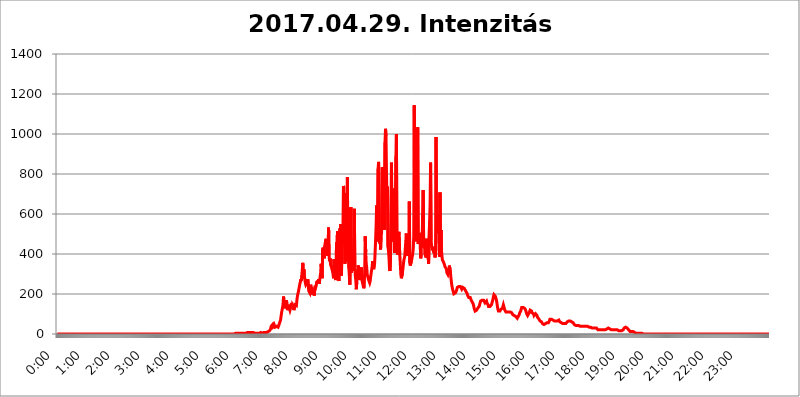
| Category | 2017.04.29. Intenzitás [W/m^2] |
|---|---|
| 0.0 | 0 |
| 0.0006944444444444445 | 0 |
| 0.001388888888888889 | 0 |
| 0.0020833333333333333 | 0 |
| 0.002777777777777778 | 0 |
| 0.003472222222222222 | 0 |
| 0.004166666666666667 | 0 |
| 0.004861111111111111 | 0 |
| 0.005555555555555556 | 0 |
| 0.0062499999999999995 | 0 |
| 0.006944444444444444 | 0 |
| 0.007638888888888889 | 0 |
| 0.008333333333333333 | 0 |
| 0.009027777777777779 | 0 |
| 0.009722222222222222 | 0 |
| 0.010416666666666666 | 0 |
| 0.011111111111111112 | 0 |
| 0.011805555555555555 | 0 |
| 0.012499999999999999 | 0 |
| 0.013194444444444444 | 0 |
| 0.013888888888888888 | 0 |
| 0.014583333333333332 | 0 |
| 0.015277777777777777 | 0 |
| 0.015972222222222224 | 0 |
| 0.016666666666666666 | 0 |
| 0.017361111111111112 | 0 |
| 0.018055555555555557 | 0 |
| 0.01875 | 0 |
| 0.019444444444444445 | 0 |
| 0.02013888888888889 | 0 |
| 0.020833333333333332 | 0 |
| 0.02152777777777778 | 0 |
| 0.022222222222222223 | 0 |
| 0.02291666666666667 | 0 |
| 0.02361111111111111 | 0 |
| 0.024305555555555556 | 0 |
| 0.024999999999999998 | 0 |
| 0.025694444444444447 | 0 |
| 0.02638888888888889 | 0 |
| 0.027083333333333334 | 0 |
| 0.027777777777777776 | 0 |
| 0.02847222222222222 | 0 |
| 0.029166666666666664 | 0 |
| 0.029861111111111113 | 0 |
| 0.030555555555555555 | 0 |
| 0.03125 | 0 |
| 0.03194444444444445 | 0 |
| 0.03263888888888889 | 0 |
| 0.03333333333333333 | 0 |
| 0.034027777777777775 | 0 |
| 0.034722222222222224 | 0 |
| 0.035416666666666666 | 0 |
| 0.036111111111111115 | 0 |
| 0.03680555555555556 | 0 |
| 0.0375 | 0 |
| 0.03819444444444444 | 0 |
| 0.03888888888888889 | 0 |
| 0.03958333333333333 | 0 |
| 0.04027777777777778 | 0 |
| 0.04097222222222222 | 0 |
| 0.041666666666666664 | 0 |
| 0.042361111111111106 | 0 |
| 0.04305555555555556 | 0 |
| 0.043750000000000004 | 0 |
| 0.044444444444444446 | 0 |
| 0.04513888888888889 | 0 |
| 0.04583333333333334 | 0 |
| 0.04652777777777778 | 0 |
| 0.04722222222222222 | 0 |
| 0.04791666666666666 | 0 |
| 0.04861111111111111 | 0 |
| 0.049305555555555554 | 0 |
| 0.049999999999999996 | 0 |
| 0.05069444444444445 | 0 |
| 0.051388888888888894 | 0 |
| 0.052083333333333336 | 0 |
| 0.05277777777777778 | 0 |
| 0.05347222222222222 | 0 |
| 0.05416666666666667 | 0 |
| 0.05486111111111111 | 0 |
| 0.05555555555555555 | 0 |
| 0.05625 | 0 |
| 0.05694444444444444 | 0 |
| 0.057638888888888885 | 0 |
| 0.05833333333333333 | 0 |
| 0.05902777777777778 | 0 |
| 0.059722222222222225 | 0 |
| 0.06041666666666667 | 0 |
| 0.061111111111111116 | 0 |
| 0.06180555555555556 | 0 |
| 0.0625 | 0 |
| 0.06319444444444444 | 0 |
| 0.06388888888888888 | 0 |
| 0.06458333333333334 | 0 |
| 0.06527777777777778 | 0 |
| 0.06597222222222222 | 0 |
| 0.06666666666666667 | 0 |
| 0.06736111111111111 | 0 |
| 0.06805555555555555 | 0 |
| 0.06874999999999999 | 0 |
| 0.06944444444444443 | 0 |
| 0.07013888888888889 | 0 |
| 0.07083333333333333 | 0 |
| 0.07152777777777779 | 0 |
| 0.07222222222222223 | 0 |
| 0.07291666666666667 | 0 |
| 0.07361111111111111 | 0 |
| 0.07430555555555556 | 0 |
| 0.075 | 0 |
| 0.07569444444444444 | 0 |
| 0.0763888888888889 | 0 |
| 0.07708333333333334 | 0 |
| 0.07777777777777778 | 0 |
| 0.07847222222222222 | 0 |
| 0.07916666666666666 | 0 |
| 0.0798611111111111 | 0 |
| 0.08055555555555556 | 0 |
| 0.08125 | 0 |
| 0.08194444444444444 | 0 |
| 0.08263888888888889 | 0 |
| 0.08333333333333333 | 0 |
| 0.08402777777777777 | 0 |
| 0.08472222222222221 | 0 |
| 0.08541666666666665 | 0 |
| 0.08611111111111112 | 0 |
| 0.08680555555555557 | 0 |
| 0.08750000000000001 | 0 |
| 0.08819444444444445 | 0 |
| 0.08888888888888889 | 0 |
| 0.08958333333333333 | 0 |
| 0.09027777777777778 | 0 |
| 0.09097222222222222 | 0 |
| 0.09166666666666667 | 0 |
| 0.09236111111111112 | 0 |
| 0.09305555555555556 | 0 |
| 0.09375 | 0 |
| 0.09444444444444444 | 0 |
| 0.09513888888888888 | 0 |
| 0.09583333333333333 | 0 |
| 0.09652777777777777 | 0 |
| 0.09722222222222222 | 0 |
| 0.09791666666666667 | 0 |
| 0.09861111111111111 | 0 |
| 0.09930555555555555 | 0 |
| 0.09999999999999999 | 0 |
| 0.10069444444444443 | 0 |
| 0.1013888888888889 | 0 |
| 0.10208333333333335 | 0 |
| 0.10277777777777779 | 0 |
| 0.10347222222222223 | 0 |
| 0.10416666666666667 | 0 |
| 0.10486111111111111 | 0 |
| 0.10555555555555556 | 0 |
| 0.10625 | 0 |
| 0.10694444444444444 | 0 |
| 0.1076388888888889 | 0 |
| 0.10833333333333334 | 0 |
| 0.10902777777777778 | 0 |
| 0.10972222222222222 | 0 |
| 0.1111111111111111 | 0 |
| 0.11180555555555556 | 0 |
| 0.11180555555555556 | 0 |
| 0.1125 | 0 |
| 0.11319444444444444 | 0 |
| 0.11388888888888889 | 0 |
| 0.11458333333333333 | 0 |
| 0.11527777777777777 | 0 |
| 0.11597222222222221 | 0 |
| 0.11666666666666665 | 0 |
| 0.1173611111111111 | 0 |
| 0.11805555555555557 | 0 |
| 0.11944444444444445 | 0 |
| 0.12013888888888889 | 0 |
| 0.12083333333333333 | 0 |
| 0.12152777777777778 | 0 |
| 0.12222222222222223 | 0 |
| 0.12291666666666667 | 0 |
| 0.12291666666666667 | 0 |
| 0.12361111111111112 | 0 |
| 0.12430555555555556 | 0 |
| 0.125 | 0 |
| 0.12569444444444444 | 0 |
| 0.12638888888888888 | 0 |
| 0.12708333333333333 | 0 |
| 0.16875 | 0 |
| 0.12847222222222224 | 0 |
| 0.12916666666666668 | 0 |
| 0.12986111111111112 | 0 |
| 0.13055555555555556 | 0 |
| 0.13125 | 0 |
| 0.13194444444444445 | 0 |
| 0.1326388888888889 | 0 |
| 0.13333333333333333 | 0 |
| 0.13402777777777777 | 0 |
| 0.13402777777777777 | 0 |
| 0.13472222222222222 | 0 |
| 0.13541666666666666 | 0 |
| 0.1361111111111111 | 0 |
| 0.13749999999999998 | 0 |
| 0.13819444444444443 | 0 |
| 0.1388888888888889 | 0 |
| 0.13958333333333334 | 0 |
| 0.14027777777777778 | 0 |
| 0.14097222222222222 | 0 |
| 0.14166666666666666 | 0 |
| 0.1423611111111111 | 0 |
| 0.14305555555555557 | 0 |
| 0.14375000000000002 | 0 |
| 0.14444444444444446 | 0 |
| 0.1451388888888889 | 0 |
| 0.1451388888888889 | 0 |
| 0.14652777777777778 | 0 |
| 0.14722222222222223 | 0 |
| 0.14791666666666667 | 0 |
| 0.1486111111111111 | 0 |
| 0.14930555555555555 | 0 |
| 0.15 | 0 |
| 0.15069444444444444 | 0 |
| 0.15138888888888888 | 0 |
| 0.15208333333333332 | 0 |
| 0.15277777777777776 | 0 |
| 0.15347222222222223 | 0 |
| 0.15416666666666667 | 0 |
| 0.15486111111111112 | 0 |
| 0.15555555555555556 | 0 |
| 0.15625 | 0 |
| 0.15694444444444444 | 0 |
| 0.15763888888888888 | 0 |
| 0.15833333333333333 | 0 |
| 0.15902777777777777 | 0 |
| 0.15972222222222224 | 0 |
| 0.16041666666666668 | 0 |
| 0.16111111111111112 | 0 |
| 0.16180555555555556 | 0 |
| 0.1625 | 0 |
| 0.16319444444444445 | 0 |
| 0.1638888888888889 | 0 |
| 0.16458333333333333 | 0 |
| 0.16527777777777777 | 0 |
| 0.16597222222222222 | 0 |
| 0.16666666666666666 | 0 |
| 0.1673611111111111 | 0 |
| 0.16805555555555554 | 0 |
| 0.16874999999999998 | 0 |
| 0.16944444444444443 | 0 |
| 0.17013888888888887 | 0 |
| 0.1708333333333333 | 0 |
| 0.17152777777777775 | 0 |
| 0.17222222222222225 | 0 |
| 0.1729166666666667 | 0 |
| 0.17361111111111113 | 0 |
| 0.17430555555555557 | 0 |
| 0.17500000000000002 | 0 |
| 0.17569444444444446 | 0 |
| 0.1763888888888889 | 0 |
| 0.17708333333333334 | 0 |
| 0.17777777777777778 | 0 |
| 0.17847222222222223 | 0 |
| 0.17916666666666667 | 0 |
| 0.1798611111111111 | 0 |
| 0.18055555555555555 | 0 |
| 0.18125 | 0 |
| 0.18194444444444444 | 0 |
| 0.1826388888888889 | 0 |
| 0.18333333333333335 | 0 |
| 0.1840277777777778 | 0 |
| 0.18472222222222223 | 0 |
| 0.18541666666666667 | 0 |
| 0.18611111111111112 | 0 |
| 0.18680555555555556 | 0 |
| 0.1875 | 0 |
| 0.18819444444444444 | 0 |
| 0.18888888888888888 | 0 |
| 0.18958333333333333 | 0 |
| 0.19027777777777777 | 0 |
| 0.1909722222222222 | 0 |
| 0.19166666666666665 | 0 |
| 0.19236111111111112 | 0 |
| 0.19305555555555554 | 0 |
| 0.19375 | 0 |
| 0.19444444444444445 | 0 |
| 0.1951388888888889 | 0 |
| 0.19583333333333333 | 0 |
| 0.19652777777777777 | 0 |
| 0.19722222222222222 | 0 |
| 0.19791666666666666 | 0 |
| 0.1986111111111111 | 0 |
| 0.19930555555555554 | 0 |
| 0.19999999999999998 | 0 |
| 0.20069444444444443 | 0 |
| 0.20138888888888887 | 0 |
| 0.2020833333333333 | 0 |
| 0.2027777777777778 | 0 |
| 0.2034722222222222 | 0 |
| 0.2041666666666667 | 0 |
| 0.20486111111111113 | 0 |
| 0.20555555555555557 | 0 |
| 0.20625000000000002 | 0 |
| 0.20694444444444446 | 0 |
| 0.2076388888888889 | 0 |
| 0.20833333333333334 | 0 |
| 0.20902777777777778 | 0 |
| 0.20972222222222223 | 0 |
| 0.21041666666666667 | 0 |
| 0.2111111111111111 | 0 |
| 0.21180555555555555 | 0 |
| 0.2125 | 0 |
| 0.21319444444444444 | 0 |
| 0.2138888888888889 | 0 |
| 0.21458333333333335 | 0 |
| 0.2152777777777778 | 0 |
| 0.21597222222222223 | 0 |
| 0.21666666666666667 | 0 |
| 0.21736111111111112 | 0 |
| 0.21805555555555556 | 0 |
| 0.21875 | 0 |
| 0.21944444444444444 | 0 |
| 0.22013888888888888 | 0 |
| 0.22083333333333333 | 0 |
| 0.22152777777777777 | 0 |
| 0.2222222222222222 | 0 |
| 0.22291666666666665 | 0 |
| 0.2236111111111111 | 0 |
| 0.22430555555555556 | 0 |
| 0.225 | 0 |
| 0.22569444444444445 | 0 |
| 0.2263888888888889 | 0 |
| 0.22708333333333333 | 0 |
| 0.22777777777777777 | 0 |
| 0.22847222222222222 | 0 |
| 0.22916666666666666 | 0 |
| 0.2298611111111111 | 0 |
| 0.23055555555555554 | 0 |
| 0.23124999999999998 | 0 |
| 0.23194444444444443 | 0 |
| 0.23263888888888887 | 0 |
| 0.2333333333333333 | 0 |
| 0.2340277777777778 | 0 |
| 0.2347222222222222 | 0 |
| 0.2354166666666667 | 0 |
| 0.23611111111111113 | 0 |
| 0.23680555555555557 | 0 |
| 0.23750000000000002 | 0 |
| 0.23819444444444446 | 0 |
| 0.2388888888888889 | 0 |
| 0.23958333333333334 | 0 |
| 0.24027777777777778 | 0 |
| 0.24097222222222223 | 0 |
| 0.24166666666666667 | 0 |
| 0.2423611111111111 | 0 |
| 0.24305555555555555 | 0 |
| 0.24375 | 0 |
| 0.24444444444444446 | 0 |
| 0.24513888888888888 | 0 |
| 0.24583333333333335 | 0 |
| 0.2465277777777778 | 0 |
| 0.24722222222222223 | 0 |
| 0.24791666666666667 | 0 |
| 0.24861111111111112 | 0 |
| 0.24930555555555556 | 0 |
| 0.25 | 3.525 |
| 0.25069444444444444 | 3.525 |
| 0.2513888888888889 | 3.525 |
| 0.2520833333333333 | 3.525 |
| 0.25277777777777777 | 3.525 |
| 0.2534722222222222 | 3.525 |
| 0.25416666666666665 | 3.525 |
| 0.2548611111111111 | 3.525 |
| 0.2555555555555556 | 3.525 |
| 0.25625000000000003 | 3.525 |
| 0.2569444444444445 | 3.525 |
| 0.2576388888888889 | 3.525 |
| 0.25833333333333336 | 3.525 |
| 0.2590277777777778 | 3.525 |
| 0.25972222222222224 | 3.525 |
| 0.2604166666666667 | 3.525 |
| 0.2611111111111111 | 3.525 |
| 0.26180555555555557 | 3.525 |
| 0.2625 | 3.525 |
| 0.26319444444444445 | 3.525 |
| 0.2638888888888889 | 3.525 |
| 0.26458333333333334 | 3.525 |
| 0.2652777777777778 | 7.887 |
| 0.2659722222222222 | 7.887 |
| 0.26666666666666666 | 7.887 |
| 0.2673611111111111 | 7.887 |
| 0.26805555555555555 | 7.887 |
| 0.26875 | 7.887 |
| 0.26944444444444443 | 7.887 |
| 0.2701388888888889 | 7.887 |
| 0.2708333333333333 | 7.887 |
| 0.27152777777777776 | 7.887 |
| 0.2722222222222222 | 12.257 |
| 0.27291666666666664 | 7.887 |
| 0.2736111111111111 | 7.887 |
| 0.2743055555555555 | 12.257 |
| 0.27499999999999997 | 7.887 |
| 0.27569444444444446 | 7.887 |
| 0.27638888888888885 | 7.887 |
| 0.27708333333333335 | 3.525 |
| 0.2777777777777778 | 3.525 |
| 0.27847222222222223 | 3.525 |
| 0.2791666666666667 | 3.525 |
| 0.2798611111111111 | 3.525 |
| 0.28055555555555556 | 3.525 |
| 0.28125 | 3.525 |
| 0.28194444444444444 | 3.525 |
| 0.2826388888888889 | 3.525 |
| 0.2833333333333333 | 3.525 |
| 0.28402777777777777 | 3.525 |
| 0.2847222222222222 | 7.887 |
| 0.28541666666666665 | 7.887 |
| 0.28611111111111115 | 3.525 |
| 0.28680555555555554 | 3.525 |
| 0.28750000000000003 | 3.525 |
| 0.2881944444444445 | 7.887 |
| 0.2888888888888889 | 7.887 |
| 0.28958333333333336 | 7.887 |
| 0.2902777777777778 | 7.887 |
| 0.29097222222222224 | 7.887 |
| 0.2916666666666667 | 7.887 |
| 0.2923611111111111 | 7.887 |
| 0.29305555555555557 | 7.887 |
| 0.29375 | 7.887 |
| 0.29444444444444445 | 7.887 |
| 0.2951388888888889 | 12.257 |
| 0.29583333333333334 | 12.257 |
| 0.2965277777777778 | 12.257 |
| 0.2972222222222222 | 12.257 |
| 0.29791666666666666 | 16.636 |
| 0.2986111111111111 | 21.024 |
| 0.29930555555555555 | 25.419 |
| 0.3 | 38.653 |
| 0.30069444444444443 | 43.079 |
| 0.3013888888888889 | 43.079 |
| 0.3020833333333333 | 47.511 |
| 0.30277777777777776 | 38.653 |
| 0.3034722222222222 | 38.653 |
| 0.30416666666666664 | 47.511 |
| 0.3048611111111111 | 47.511 |
| 0.3055555555555555 | 34.234 |
| 0.30624999999999997 | 29.823 |
| 0.3069444444444444 | 29.823 |
| 0.3076388888888889 | 38.653 |
| 0.30833333333333335 | 38.653 |
| 0.3090277777777778 | 34.234 |
| 0.30972222222222223 | 34.234 |
| 0.3104166666666667 | 38.653 |
| 0.3111111111111111 | 47.511 |
| 0.31180555555555556 | 51.951 |
| 0.3125 | 51.951 |
| 0.31319444444444444 | 69.775 |
| 0.3138888888888889 | 87.692 |
| 0.3145833333333333 | 105.69 |
| 0.31527777777777777 | 119.235 |
| 0.3159722222222222 | 119.235 |
| 0.31666666666666665 | 146.423 |
| 0.31736111111111115 | 187.378 |
| 0.31805555555555554 | 160.056 |
| 0.31875000000000003 | 137.347 |
| 0.3194444444444445 | 128.284 |
| 0.3201388888888889 | 128.284 |
| 0.32083333333333336 | 132.814 |
| 0.3215277777777778 | 169.156 |
| 0.32222222222222224 | 137.347 |
| 0.3229166666666667 | 119.235 |
| 0.3236111111111111 | 123.758 |
| 0.32430555555555557 | 146.423 |
| 0.325 | 150.964 |
| 0.32569444444444445 | 128.284 |
| 0.3263888888888889 | 119.235 |
| 0.32708333333333334 | 119.235 |
| 0.3277777777777778 | 137.347 |
| 0.3284722222222222 | 155.509 |
| 0.32916666666666666 | 128.284 |
| 0.3298611111111111 | 146.423 |
| 0.33055555555555555 | 141.884 |
| 0.33125 | 137.347 |
| 0.33194444444444443 | 119.235 |
| 0.3326388888888889 | 123.758 |
| 0.3333333333333333 | 146.423 |
| 0.3340277777777778 | 146.423 |
| 0.3347222222222222 | 146.423 |
| 0.3354166666666667 | 141.884 |
| 0.3361111111111111 | 169.156 |
| 0.3368055555555556 | 187.378 |
| 0.33749999999999997 | 201.058 |
| 0.33819444444444446 | 210.182 |
| 0.33888888888888885 | 210.182 |
| 0.33958333333333335 | 205.62 |
| 0.34027777777777773 | 251.251 |
| 0.34097222222222223 | 260.373 |
| 0.3416666666666666 | 274.047 |
| 0.3423611111111111 | 264.932 |
| 0.3430555555555555 | 292.259 |
| 0.34375 | 296.808 |
| 0.3444444444444445 | 355.712 |
| 0.3451388888888889 | 278.603 |
| 0.3458333333333334 | 324.052 |
| 0.34652777777777777 | 292.259 |
| 0.34722222222222227 | 287.709 |
| 0.34791666666666665 | 255.813 |
| 0.34861111111111115 | 246.689 |
| 0.34930555555555554 | 242.127 |
| 0.35000000000000003 | 255.813 |
| 0.3506944444444444 | 260.373 |
| 0.3513888888888889 | 274.047 |
| 0.3520833333333333 | 242.127 |
| 0.3527777777777778 | 214.746 |
| 0.3534722222222222 | 214.746 |
| 0.3541666666666667 | 205.62 |
| 0.3548611111111111 | 228.436 |
| 0.35555555555555557 | 246.689 |
| 0.35625 | 219.309 |
| 0.35694444444444445 | 233 |
| 0.3576388888888889 | 205.62 |
| 0.35833333333333334 | 210.182 |
| 0.3590277777777778 | 201.058 |
| 0.3597222222222222 | 210.182 |
| 0.36041666666666666 | 191.937 |
| 0.3611111111111111 | 228.436 |
| 0.36180555555555555 | 242.127 |
| 0.3625 | 233 |
| 0.36319444444444443 | 242.127 |
| 0.3638888888888889 | 260.373 |
| 0.3645833333333333 | 255.813 |
| 0.3652777777777778 | 255.813 |
| 0.3659722222222222 | 264.932 |
| 0.3666666666666667 | 274.047 |
| 0.3673611111111111 | 251.251 |
| 0.3680555555555556 | 269.49 |
| 0.36874999999999997 | 274.047 |
| 0.36944444444444446 | 305.898 |
| 0.37013888888888885 | 351.198 |
| 0.37083333333333335 | 314.98 |
| 0.37152777777777773 | 278.603 |
| 0.37222222222222223 | 422.943 |
| 0.3729166666666666 | 431.833 |
| 0.3736111111111111 | 396.164 |
| 0.3743055555555555 | 378.224 |
| 0.375 | 436.27 |
| 0.3756944444444445 | 431.833 |
| 0.3763888888888889 | 467.187 |
| 0.3770833333333334 | 475.972 |
| 0.37777777777777777 | 436.27 |
| 0.37847222222222227 | 400.638 |
| 0.37916666666666665 | 391.685 |
| 0.37986111111111115 | 445.129 |
| 0.38055555555555554 | 532.513 |
| 0.38125000000000003 | 391.685 |
| 0.3819444444444444 | 364.728 |
| 0.3826388888888889 | 378.224 |
| 0.3833333333333333 | 346.682 |
| 0.3840277777777778 | 351.198 |
| 0.3847222222222222 | 333.113 |
| 0.3854166666666667 | 337.639 |
| 0.3861111111111111 | 328.584 |
| 0.38680555555555557 | 301.354 |
| 0.3875 | 278.603 |
| 0.38819444444444445 | 373.729 |
| 0.3888888888888889 | 337.639 |
| 0.38958333333333334 | 355.712 |
| 0.3902777777777778 | 269.49 |
| 0.3909722222222222 | 305.898 |
| 0.39166666666666666 | 458.38 |
| 0.3923611111111111 | 431.833 |
| 0.39305555555555555 | 515.223 |
| 0.39375 | 364.728 |
| 0.39444444444444443 | 278.603 |
| 0.3951388888888889 | 264.932 |
| 0.3958333333333333 | 471.582 |
| 0.3965277777777778 | 528.2 |
| 0.3972222222222222 | 324.052 |
| 0.3979166666666667 | 549.704 |
| 0.3986111111111111 | 292.259 |
| 0.3993055555555556 | 449.551 |
| 0.39999999999999997 | 484.735 |
| 0.40069444444444446 | 515.223 |
| 0.40138888888888885 | 739.877 |
| 0.40208333333333335 | 731.896 |
| 0.40277777777777773 | 480.356 |
| 0.40347222222222223 | 351.198 |
| 0.4041666666666666 | 436.27 |
| 0.4048611111111111 | 703.762 |
| 0.4055555555555555 | 360.221 |
| 0.40625 | 418.492 |
| 0.4069444444444445 | 783.342 |
| 0.4076388888888889 | 360.221 |
| 0.4083333333333334 | 558.261 |
| 0.40902777777777777 | 328.584 |
| 0.40972222222222227 | 287.709 |
| 0.41041666666666665 | 246.689 |
| 0.41111111111111115 | 251.251 |
| 0.41180555555555554 | 634.105 |
| 0.41250000000000003 | 305.898 |
| 0.4131944444444444 | 355.712 |
| 0.4138888888888889 | 364.728 |
| 0.4145833333333333 | 314.98 |
| 0.4152777777777778 | 337.639 |
| 0.4159722222222222 | 467.187 |
| 0.4166666666666667 | 625.784 |
| 0.4173611111111111 | 333.113 |
| 0.41805555555555557 | 287.709 |
| 0.41875 | 269.49 |
| 0.41944444444444445 | 223.873 |
| 0.4201388888888889 | 260.373 |
| 0.42083333333333334 | 319.517 |
| 0.4215277777777778 | 296.808 |
| 0.4222222222222222 | 342.162 |
| 0.42291666666666666 | 292.259 |
| 0.4236111111111111 | 269.49 |
| 0.42430555555555555 | 292.259 |
| 0.425 | 301.354 |
| 0.42569444444444443 | 310.44 |
| 0.4263888888888889 | 333.113 |
| 0.4270833333333333 | 283.156 |
| 0.4277777777777778 | 260.373 |
| 0.4284722222222222 | 251.251 |
| 0.4291666666666667 | 251.251 |
| 0.4298611111111111 | 228.436 |
| 0.4305555555555556 | 242.127 |
| 0.43124999999999997 | 324.052 |
| 0.43194444444444446 | 489.108 |
| 0.43263888888888885 | 409.574 |
| 0.43333333333333335 | 351.198 |
| 0.43402777777777773 | 333.113 |
| 0.43472222222222223 | 296.808 |
| 0.4354166666666666 | 292.259 |
| 0.4361111111111111 | 278.603 |
| 0.4368055555555555 | 269.49 |
| 0.4375 | 264.932 |
| 0.4381944444444445 | 255.813 |
| 0.4388888888888889 | 264.932 |
| 0.4395833333333334 | 287.709 |
| 0.44027777777777777 | 287.709 |
| 0.44097222222222227 | 287.709 |
| 0.44166666666666665 | 337.639 |
| 0.44236111111111115 | 364.728 |
| 0.44305555555555554 | 333.113 |
| 0.44375000000000003 | 324.052 |
| 0.4444444444444444 | 319.517 |
| 0.4451388888888889 | 355.712 |
| 0.4458333333333333 | 409.574 |
| 0.4465277777777778 | 471.582 |
| 0.4472222222222222 | 541.121 |
| 0.4479166666666667 | 642.4 |
| 0.4486111111111111 | 519.555 |
| 0.44930555555555557 | 462.786 |
| 0.45 | 826.123 |
| 0.45069444444444445 | 860.676 |
| 0.4513888888888889 | 549.704 |
| 0.45208333333333334 | 453.968 |
| 0.4527777777777778 | 489.108 |
| 0.4534722222222222 | 422.943 |
| 0.45416666666666666 | 484.735 |
| 0.4548611111111111 | 506.542 |
| 0.45555555555555555 | 833.834 |
| 0.45625 | 826.123 |
| 0.45694444444444443 | 523.88 |
| 0.4576388888888889 | 536.82 |
| 0.4583333333333333 | 822.26 |
| 0.4590277777777778 | 519.555 |
| 0.4597222222222222 | 958.814 |
| 0.4604166666666667 | 1026.06 |
| 0.4611111111111111 | 988.714 |
| 0.4618055555555556 | 798.974 |
| 0.46249999999999997 | 658.909 |
| 0.46319444444444446 | 735.89 |
| 0.46388888888888885 | 436.27 |
| 0.46458333333333335 | 414.035 |
| 0.46527777777777773 | 382.715 |
| 0.46597222222222223 | 328.584 |
| 0.4666666666666666 | 314.98 |
| 0.4673611111111111 | 373.729 |
| 0.4680555555555555 | 378.224 |
| 0.46875 | 856.855 |
| 0.4694444444444445 | 480.356 |
| 0.4701388888888889 | 558.261 |
| 0.4708333333333334 | 727.896 |
| 0.47152777777777777 | 462.786 |
| 0.47222222222222227 | 715.858 |
| 0.47291666666666665 | 405.108 |
| 0.47361111111111115 | 519.555 |
| 0.47430555555555554 | 489.108 |
| 0.47500000000000003 | 887.309 |
| 0.4756944444444444 | 999.916 |
| 0.4763888888888889 | 431.833 |
| 0.4770833333333333 | 396.164 |
| 0.4777777777777778 | 458.38 |
| 0.4784722222222222 | 458.38 |
| 0.4791666666666667 | 510.885 |
| 0.4798611111111111 | 449.551 |
| 0.48055555555555557 | 387.202 |
| 0.48125 | 342.162 |
| 0.48194444444444445 | 296.808 |
| 0.4826388888888889 | 278.603 |
| 0.48333333333333334 | 283.156 |
| 0.4840277777777778 | 301.354 |
| 0.4847222222222222 | 324.052 |
| 0.48541666666666666 | 346.682 |
| 0.4861111111111111 | 369.23 |
| 0.48680555555555555 | 378.224 |
| 0.4875 | 391.685 |
| 0.48819444444444443 | 387.202 |
| 0.4888888888888889 | 396.164 |
| 0.4895833333333333 | 502.192 |
| 0.4902777777777778 | 431.833 |
| 0.4909722222222222 | 391.685 |
| 0.4916666666666667 | 400.638 |
| 0.4923611111111111 | 414.035 |
| 0.4930555555555556 | 431.833 |
| 0.49374999999999997 | 663.019 |
| 0.49444444444444446 | 355.712 |
| 0.49513888888888885 | 342.162 |
| 0.49583333333333335 | 346.682 |
| 0.49652777777777773 | 346.682 |
| 0.49722222222222223 | 373.729 |
| 0.4979166666666666 | 387.202 |
| 0.4986111111111111 | 400.638 |
| 0.4993055555555555 | 427.39 |
| 0.5 | 489.108 |
| 0.5006944444444444 | 1143.232 |
| 0.5013888888888889 | 484.735 |
| 0.5020833333333333 | 617.436 |
| 0.5027777777777778 | 475.972 |
| 0.5034722222222222 | 462.786 |
| 0.5041666666666667 | 489.108 |
| 0.5048611111111111 | 675.311 |
| 0.5055555555555555 | 1033.537 |
| 0.50625 | 449.551 |
| 0.5069444444444444 | 462.786 |
| 0.5076388888888889 | 462.786 |
| 0.5083333333333333 | 502.192 |
| 0.5090277777777777 | 449.551 |
| 0.5097222222222222 | 378.224 |
| 0.5104166666666666 | 396.164 |
| 0.5111111111111112 | 506.542 |
| 0.5118055555555555 | 431.833 |
| 0.5125000000000001 | 600.661 |
| 0.5131944444444444 | 719.877 |
| 0.513888888888889 | 458.38 |
| 0.5145833333333333 | 440.702 |
| 0.5152777777777778 | 453.968 |
| 0.5159722222222222 | 396.164 |
| 0.5166666666666667 | 391.685 |
| 0.517361111111111 | 382.715 |
| 0.5180555555555556 | 475.972 |
| 0.5187499999999999 | 409.574 |
| 0.5194444444444445 | 382.715 |
| 0.5201388888888888 | 396.164 |
| 0.5208333333333334 | 351.198 |
| 0.5215277777777778 | 351.198 |
| 0.5222222222222223 | 562.53 |
| 0.5229166666666667 | 646.537 |
| 0.5236111111111111 | 856.855 |
| 0.5243055555555556 | 471.582 |
| 0.525 | 440.702 |
| 0.5256944444444445 | 431.833 |
| 0.5263888888888889 | 418.492 |
| 0.5270833333333333 | 436.27 |
| 0.5277777777777778 | 409.574 |
| 0.5284722222222222 | 414.035 |
| 0.5291666666666667 | 400.638 |
| 0.5298611111111111 | 382.715 |
| 0.5305555555555556 | 400.638 |
| 0.53125 | 984.98 |
| 0.5319444444444444 | 532.513 |
| 0.5326388888888889 | 562.53 |
| 0.5333333333333333 | 545.416 |
| 0.5340277777777778 | 596.45 |
| 0.5347222222222222 | 528.2 |
| 0.5354166666666667 | 427.39 |
| 0.5361111111111111 | 387.202 |
| 0.5368055555555555 | 707.8 |
| 0.5375 | 387.202 |
| 0.5381944444444444 | 519.555 |
| 0.5388888888888889 | 418.492 |
| 0.5395833333333333 | 387.202 |
| 0.5402777777777777 | 369.23 |
| 0.5409722222222222 | 364.728 |
| 0.5416666666666666 | 360.221 |
| 0.5423611111111112 | 360.221 |
| 0.5430555555555555 | 346.682 |
| 0.5437500000000001 | 337.639 |
| 0.5444444444444444 | 342.162 |
| 0.545138888888889 | 333.113 |
| 0.5458333333333333 | 324.052 |
| 0.5465277777777778 | 305.898 |
| 0.5472222222222222 | 305.898 |
| 0.5479166666666667 | 296.808 |
| 0.548611111111111 | 296.808 |
| 0.5493055555555556 | 314.98 |
| 0.5499999999999999 | 342.162 |
| 0.5506944444444445 | 342.162 |
| 0.5513888888888888 | 310.44 |
| 0.5520833333333334 | 283.156 |
| 0.5527777777777778 | 260.373 |
| 0.5534722222222223 | 242.127 |
| 0.5541666666666667 | 228.436 |
| 0.5548611111111111 | 219.309 |
| 0.5555555555555556 | 210.182 |
| 0.55625 | 201.058 |
| 0.5569444444444445 | 196.497 |
| 0.5576388888888889 | 201.058 |
| 0.5583333333333333 | 205.62 |
| 0.5590277777777778 | 210.182 |
| 0.5597222222222222 | 214.746 |
| 0.5604166666666667 | 223.873 |
| 0.5611111111111111 | 233 |
| 0.5618055555555556 | 233 |
| 0.5625 | 237.564 |
| 0.5631944444444444 | 237.564 |
| 0.5638888888888889 | 242.127 |
| 0.5645833333333333 | 242.127 |
| 0.5652777777777778 | 237.564 |
| 0.5659722222222222 | 242.127 |
| 0.5666666666666667 | 233 |
| 0.5673611111111111 | 223.873 |
| 0.5680555555555555 | 228.436 |
| 0.56875 | 233 |
| 0.5694444444444444 | 237.564 |
| 0.5701388888888889 | 237.564 |
| 0.5708333333333333 | 228.436 |
| 0.5715277777777777 | 223.873 |
| 0.5722222222222222 | 219.309 |
| 0.5729166666666666 | 214.746 |
| 0.5736111111111112 | 210.182 |
| 0.5743055555555555 | 205.62 |
| 0.5750000000000001 | 201.058 |
| 0.5756944444444444 | 191.937 |
| 0.576388888888889 | 187.378 |
| 0.5770833333333333 | 182.82 |
| 0.5777777777777778 | 182.82 |
| 0.5784722222222222 | 182.82 |
| 0.5791666666666667 | 182.82 |
| 0.579861111111111 | 178.264 |
| 0.5805555555555556 | 169.156 |
| 0.5812499999999999 | 164.605 |
| 0.5819444444444445 | 160.056 |
| 0.5826388888888888 | 155.509 |
| 0.5833333333333334 | 150.964 |
| 0.5840277777777778 | 141.884 |
| 0.5847222222222223 | 128.284 |
| 0.5854166666666667 | 123.758 |
| 0.5861111111111111 | 114.716 |
| 0.5868055555555556 | 114.716 |
| 0.5875 | 114.716 |
| 0.5881944444444445 | 119.235 |
| 0.5888888888888889 | 123.758 |
| 0.5895833333333333 | 128.284 |
| 0.5902777777777778 | 128.284 |
| 0.5909722222222222 | 132.814 |
| 0.5916666666666667 | 137.347 |
| 0.5923611111111111 | 146.423 |
| 0.5930555555555556 | 155.509 |
| 0.59375 | 164.605 |
| 0.5944444444444444 | 164.605 |
| 0.5951388888888889 | 169.156 |
| 0.5958333333333333 | 169.156 |
| 0.5965277777777778 | 169.156 |
| 0.5972222222222222 | 169.156 |
| 0.5979166666666667 | 169.156 |
| 0.5986111111111111 | 173.709 |
| 0.5993055555555555 | 164.605 |
| 0.6 | 155.509 |
| 0.6006944444444444 | 155.509 |
| 0.6013888888888889 | 160.056 |
| 0.6020833333333333 | 164.605 |
| 0.6027777777777777 | 155.509 |
| 0.6034722222222222 | 150.964 |
| 0.6041666666666666 | 146.423 |
| 0.6048611111111112 | 137.347 |
| 0.6055555555555555 | 132.814 |
| 0.6062500000000001 | 137.347 |
| 0.6069444444444444 | 137.347 |
| 0.607638888888889 | 137.347 |
| 0.6083333333333333 | 141.884 |
| 0.6090277777777778 | 146.423 |
| 0.6097222222222222 | 155.509 |
| 0.6104166666666667 | 164.605 |
| 0.611111111111111 | 173.709 |
| 0.6118055555555556 | 187.378 |
| 0.6124999999999999 | 196.497 |
| 0.6131944444444445 | 201.058 |
| 0.6138888888888888 | 191.937 |
| 0.6145833333333334 | 187.378 |
| 0.6152777777777778 | 182.82 |
| 0.6159722222222223 | 169.156 |
| 0.6166666666666667 | 155.509 |
| 0.6173611111111111 | 137.347 |
| 0.6180555555555556 | 123.758 |
| 0.61875 | 114.716 |
| 0.6194444444444445 | 110.201 |
| 0.6201388888888889 | 110.201 |
| 0.6208333333333333 | 114.716 |
| 0.6215277777777778 | 119.235 |
| 0.6222222222222222 | 123.758 |
| 0.6229166666666667 | 123.758 |
| 0.6236111111111111 | 128.284 |
| 0.6243055555555556 | 128.284 |
| 0.625 | 137.347 |
| 0.6256944444444444 | 146.423 |
| 0.6263888888888889 | 137.347 |
| 0.6270833333333333 | 128.284 |
| 0.6277777777777778 | 119.235 |
| 0.6284722222222222 | 114.716 |
| 0.6291666666666667 | 110.201 |
| 0.6298611111111111 | 110.201 |
| 0.6305555555555555 | 110.201 |
| 0.63125 | 110.201 |
| 0.6319444444444444 | 110.201 |
| 0.6326388888888889 | 110.201 |
| 0.6333333333333333 | 110.201 |
| 0.6340277777777777 | 110.201 |
| 0.6347222222222222 | 110.201 |
| 0.6354166666666666 | 110.201 |
| 0.6361111111111112 | 110.201 |
| 0.6368055555555555 | 110.201 |
| 0.6375000000000001 | 105.69 |
| 0.6381944444444444 | 101.184 |
| 0.638888888888889 | 96.682 |
| 0.6395833333333333 | 92.184 |
| 0.6402777777777778 | 92.184 |
| 0.6409722222222222 | 92.184 |
| 0.6416666666666667 | 92.184 |
| 0.642361111111111 | 92.184 |
| 0.6430555555555556 | 87.692 |
| 0.6437499999999999 | 83.205 |
| 0.6444444444444445 | 83.205 |
| 0.6451388888888888 | 78.722 |
| 0.6458333333333334 | 83.205 |
| 0.6465277777777778 | 87.692 |
| 0.6472222222222223 | 92.184 |
| 0.6479166666666667 | 96.682 |
| 0.6486111111111111 | 105.69 |
| 0.6493055555555556 | 110.201 |
| 0.65 | 114.716 |
| 0.6506944444444445 | 123.758 |
| 0.6513888888888889 | 132.814 |
| 0.6520833333333333 | 137.347 |
| 0.6527777777777778 | 137.347 |
| 0.6534722222222222 | 132.814 |
| 0.6541666666666667 | 128.284 |
| 0.6548611111111111 | 128.284 |
| 0.6555555555555556 | 128.284 |
| 0.65625 | 128.284 |
| 0.6569444444444444 | 119.235 |
| 0.6576388888888889 | 114.716 |
| 0.6583333333333333 | 101.184 |
| 0.6590277777777778 | 96.682 |
| 0.6597222222222222 | 92.184 |
| 0.6604166666666667 | 92.184 |
| 0.6611111111111111 | 96.682 |
| 0.6618055555555555 | 105.69 |
| 0.6625 | 110.201 |
| 0.6631944444444444 | 119.235 |
| 0.6638888888888889 | 123.758 |
| 0.6645833333333333 | 119.235 |
| 0.6652777777777777 | 114.716 |
| 0.6659722222222222 | 105.69 |
| 0.6666666666666666 | 101.184 |
| 0.6673611111111111 | 101.184 |
| 0.6680555555555556 | 101.184 |
| 0.6687500000000001 | 92.184 |
| 0.6694444444444444 | 92.184 |
| 0.6701388888888888 | 96.682 |
| 0.6708333333333334 | 101.184 |
| 0.6715277777777778 | 101.184 |
| 0.6722222222222222 | 96.682 |
| 0.6729166666666666 | 92.184 |
| 0.6736111111111112 | 83.205 |
| 0.6743055555555556 | 83.205 |
| 0.6749999999999999 | 78.722 |
| 0.6756944444444444 | 74.246 |
| 0.6763888888888889 | 69.775 |
| 0.6770833333333334 | 65.31 |
| 0.6777777777777777 | 65.31 |
| 0.6784722222222223 | 65.31 |
| 0.6791666666666667 | 60.85 |
| 0.6798611111111111 | 56.398 |
| 0.6805555555555555 | 51.951 |
| 0.68125 | 47.511 |
| 0.6819444444444445 | 47.511 |
| 0.6826388888888889 | 47.511 |
| 0.6833333333333332 | 47.511 |
| 0.6840277777777778 | 47.511 |
| 0.6847222222222222 | 51.951 |
| 0.6854166666666667 | 51.951 |
| 0.686111111111111 | 51.951 |
| 0.6868055555555556 | 56.398 |
| 0.6875 | 56.398 |
| 0.6881944444444444 | 56.398 |
| 0.688888888888889 | 56.398 |
| 0.6895833333333333 | 60.85 |
| 0.6902777777777778 | 65.31 |
| 0.6909722222222222 | 74.246 |
| 0.6916666666666668 | 74.246 |
| 0.6923611111111111 | 74.246 |
| 0.6930555555555555 | 74.246 |
| 0.69375 | 74.246 |
| 0.6944444444444445 | 69.775 |
| 0.6951388888888889 | 69.775 |
| 0.6958333333333333 | 65.31 |
| 0.6965277777777777 | 65.31 |
| 0.6972222222222223 | 65.31 |
| 0.6979166666666666 | 65.31 |
| 0.6986111111111111 | 65.31 |
| 0.6993055555555556 | 65.31 |
| 0.7000000000000001 | 65.31 |
| 0.7006944444444444 | 65.31 |
| 0.7013888888888888 | 65.31 |
| 0.7020833333333334 | 69.775 |
| 0.7027777777777778 | 69.775 |
| 0.7034722222222222 | 69.775 |
| 0.7041666666666666 | 65.31 |
| 0.7048611111111112 | 60.85 |
| 0.7055555555555556 | 60.85 |
| 0.7062499999999999 | 56.398 |
| 0.7069444444444444 | 56.398 |
| 0.7076388888888889 | 56.398 |
| 0.7083333333333334 | 56.398 |
| 0.7090277777777777 | 51.951 |
| 0.7097222222222223 | 51.951 |
| 0.7104166666666667 | 47.511 |
| 0.7111111111111111 | 51.951 |
| 0.7118055555555555 | 47.511 |
| 0.7125 | 47.511 |
| 0.7131944444444445 | 51.951 |
| 0.7138888888888889 | 51.951 |
| 0.7145833333333332 | 56.398 |
| 0.7152777777777778 | 60.85 |
| 0.7159722222222222 | 65.31 |
| 0.7166666666666667 | 65.31 |
| 0.717361111111111 | 65.31 |
| 0.7180555555555556 | 65.31 |
| 0.71875 | 65.31 |
| 0.7194444444444444 | 65.31 |
| 0.720138888888889 | 65.31 |
| 0.7208333333333333 | 65.31 |
| 0.7215277777777778 | 60.85 |
| 0.7222222222222222 | 60.85 |
| 0.7229166666666668 | 60.85 |
| 0.7236111111111111 | 56.398 |
| 0.7243055555555555 | 51.951 |
| 0.725 | 47.511 |
| 0.7256944444444445 | 43.079 |
| 0.7263888888888889 | 43.079 |
| 0.7270833333333333 | 43.079 |
| 0.7277777777777777 | 38.653 |
| 0.7284722222222223 | 43.079 |
| 0.7291666666666666 | 43.079 |
| 0.7298611111111111 | 43.079 |
| 0.7305555555555556 | 43.079 |
| 0.7312500000000001 | 43.079 |
| 0.7319444444444444 | 38.653 |
| 0.7326388888888888 | 43.079 |
| 0.7333333333333334 | 38.653 |
| 0.7340277777777778 | 38.653 |
| 0.7347222222222222 | 38.653 |
| 0.7354166666666666 | 38.653 |
| 0.7361111111111112 | 38.653 |
| 0.7368055555555556 | 38.653 |
| 0.7374999999999999 | 38.653 |
| 0.7381944444444444 | 38.653 |
| 0.7388888888888889 | 38.653 |
| 0.7395833333333334 | 38.653 |
| 0.7402777777777777 | 38.653 |
| 0.7409722222222223 | 38.653 |
| 0.7416666666666667 | 38.653 |
| 0.7423611111111111 | 38.653 |
| 0.7430555555555555 | 38.653 |
| 0.74375 | 38.653 |
| 0.7444444444444445 | 34.234 |
| 0.7451388888888889 | 34.234 |
| 0.7458333333333332 | 34.234 |
| 0.7465277777777778 | 38.653 |
| 0.7472222222222222 | 38.653 |
| 0.7479166666666667 | 34.234 |
| 0.748611111111111 | 34.234 |
| 0.7493055555555556 | 34.234 |
| 0.75 | 29.823 |
| 0.7506944444444444 | 29.823 |
| 0.751388888888889 | 29.823 |
| 0.7520833333333333 | 29.823 |
| 0.7527777777777778 | 29.823 |
| 0.7534722222222222 | 29.823 |
| 0.7541666666666668 | 29.823 |
| 0.7548611111111111 | 29.823 |
| 0.7555555555555555 | 29.823 |
| 0.75625 | 29.823 |
| 0.7569444444444445 | 25.419 |
| 0.7576388888888889 | 25.419 |
| 0.7583333333333333 | 21.024 |
| 0.7590277777777777 | 21.024 |
| 0.7597222222222223 | 21.024 |
| 0.7604166666666666 | 21.024 |
| 0.7611111111111111 | 21.024 |
| 0.7618055555555556 | 21.024 |
| 0.7625000000000001 | 21.024 |
| 0.7631944444444444 | 21.024 |
| 0.7638888888888888 | 21.024 |
| 0.7645833333333334 | 21.024 |
| 0.7652777777777778 | 21.024 |
| 0.7659722222222222 | 21.024 |
| 0.7666666666666666 | 21.024 |
| 0.7673611111111112 | 25.419 |
| 0.7680555555555556 | 21.024 |
| 0.7687499999999999 | 21.024 |
| 0.7694444444444444 | 21.024 |
| 0.7701388888888889 | 21.024 |
| 0.7708333333333334 | 25.419 |
| 0.7715277777777777 | 25.419 |
| 0.7722222222222223 | 29.823 |
| 0.7729166666666667 | 29.823 |
| 0.7736111111111111 | 29.823 |
| 0.7743055555555555 | 29.823 |
| 0.775 | 25.419 |
| 0.7756944444444445 | 21.024 |
| 0.7763888888888889 | 21.024 |
| 0.7770833333333332 | 21.024 |
| 0.7777777777777778 | 21.024 |
| 0.7784722222222222 | 21.024 |
| 0.7791666666666667 | 21.024 |
| 0.779861111111111 | 21.024 |
| 0.7805555555555556 | 21.024 |
| 0.78125 | 21.024 |
| 0.7819444444444444 | 21.024 |
| 0.782638888888889 | 21.024 |
| 0.7833333333333333 | 21.024 |
| 0.7840277777777778 | 21.024 |
| 0.7847222222222222 | 21.024 |
| 0.7854166666666668 | 21.024 |
| 0.7861111111111111 | 16.636 |
| 0.7868055555555555 | 21.024 |
| 0.7875 | 16.636 |
| 0.7881944444444445 | 21.024 |
| 0.7888888888888889 | 21.024 |
| 0.7895833333333333 | 16.636 |
| 0.7902777777777777 | 16.636 |
| 0.7909722222222223 | 16.636 |
| 0.7916666666666666 | 16.636 |
| 0.7923611111111111 | 21.024 |
| 0.7930555555555556 | 21.024 |
| 0.7937500000000001 | 21.024 |
| 0.7944444444444444 | 25.419 |
| 0.7951388888888888 | 29.823 |
| 0.7958333333333334 | 29.823 |
| 0.7965277777777778 | 34.234 |
| 0.7972222222222222 | 34.234 |
| 0.7979166666666666 | 34.234 |
| 0.7986111111111112 | 29.823 |
| 0.7993055555555556 | 29.823 |
| 0.7999999999999999 | 25.419 |
| 0.8006944444444444 | 25.419 |
| 0.8013888888888889 | 21.024 |
| 0.8020833333333334 | 21.024 |
| 0.8027777777777777 | 16.636 |
| 0.8034722222222223 | 12.257 |
| 0.8041666666666667 | 12.257 |
| 0.8048611111111111 | 12.257 |
| 0.8055555555555555 | 12.257 |
| 0.80625 | 7.887 |
| 0.8069444444444445 | 7.887 |
| 0.8076388888888889 | 12.257 |
| 0.8083333333333332 | 7.887 |
| 0.8090277777777778 | 7.887 |
| 0.8097222222222222 | 7.887 |
| 0.8104166666666667 | 7.887 |
| 0.811111111111111 | 7.887 |
| 0.8118055555555556 | 3.525 |
| 0.8125 | 7.887 |
| 0.8131944444444444 | 3.525 |
| 0.813888888888889 | 3.525 |
| 0.8145833333333333 | 3.525 |
| 0.8152777777777778 | 3.525 |
| 0.8159722222222222 | 3.525 |
| 0.8166666666666668 | 3.525 |
| 0.8173611111111111 | 3.525 |
| 0.8180555555555555 | 3.525 |
| 0.81875 | 3.525 |
| 0.8194444444444445 | 3.525 |
| 0.8201388888888889 | 3.525 |
| 0.8208333333333333 | 0 |
| 0.8215277777777777 | 3.525 |
| 0.8222222222222223 | 0 |
| 0.8229166666666666 | 0 |
| 0.8236111111111111 | 0 |
| 0.8243055555555556 | 0 |
| 0.8250000000000001 | 0 |
| 0.8256944444444444 | 0 |
| 0.8263888888888888 | 0 |
| 0.8270833333333334 | 0 |
| 0.8277777777777778 | 0 |
| 0.8284722222222222 | 0 |
| 0.8291666666666666 | 0 |
| 0.8298611111111112 | 0 |
| 0.8305555555555556 | 0 |
| 0.8312499999999999 | 0 |
| 0.8319444444444444 | 0 |
| 0.8326388888888889 | 0 |
| 0.8333333333333334 | 0 |
| 0.8340277777777777 | 0 |
| 0.8347222222222223 | 0 |
| 0.8354166666666667 | 0 |
| 0.8361111111111111 | 0 |
| 0.8368055555555555 | 0 |
| 0.8375 | 0 |
| 0.8381944444444445 | 0 |
| 0.8388888888888889 | 0 |
| 0.8395833333333332 | 0 |
| 0.8402777777777778 | 0 |
| 0.8409722222222222 | 0 |
| 0.8416666666666667 | 0 |
| 0.842361111111111 | 0 |
| 0.8430555555555556 | 0 |
| 0.84375 | 0 |
| 0.8444444444444444 | 0 |
| 0.845138888888889 | 0 |
| 0.8458333333333333 | 0 |
| 0.8465277777777778 | 0 |
| 0.8472222222222222 | 0 |
| 0.8479166666666668 | 0 |
| 0.8486111111111111 | 0 |
| 0.8493055555555555 | 0 |
| 0.85 | 0 |
| 0.8506944444444445 | 0 |
| 0.8513888888888889 | 0 |
| 0.8520833333333333 | 0 |
| 0.8527777777777777 | 0 |
| 0.8534722222222223 | 0 |
| 0.8541666666666666 | 0 |
| 0.8548611111111111 | 0 |
| 0.8555555555555556 | 0 |
| 0.8562500000000001 | 0 |
| 0.8569444444444444 | 0 |
| 0.8576388888888888 | 0 |
| 0.8583333333333334 | 0 |
| 0.8590277777777778 | 0 |
| 0.8597222222222222 | 0 |
| 0.8604166666666666 | 0 |
| 0.8611111111111112 | 0 |
| 0.8618055555555556 | 0 |
| 0.8624999999999999 | 0 |
| 0.8631944444444444 | 0 |
| 0.8638888888888889 | 0 |
| 0.8645833333333334 | 0 |
| 0.8652777777777777 | 0 |
| 0.8659722222222223 | 0 |
| 0.8666666666666667 | 0 |
| 0.8673611111111111 | 0 |
| 0.8680555555555555 | 0 |
| 0.86875 | 0 |
| 0.8694444444444445 | 0 |
| 0.8701388888888889 | 0 |
| 0.8708333333333332 | 0 |
| 0.8715277777777778 | 0 |
| 0.8722222222222222 | 0 |
| 0.8729166666666667 | 0 |
| 0.873611111111111 | 0 |
| 0.8743055555555556 | 0 |
| 0.875 | 0 |
| 0.8756944444444444 | 0 |
| 0.876388888888889 | 0 |
| 0.8770833333333333 | 0 |
| 0.8777777777777778 | 0 |
| 0.8784722222222222 | 0 |
| 0.8791666666666668 | 0 |
| 0.8798611111111111 | 0 |
| 0.8805555555555555 | 0 |
| 0.88125 | 0 |
| 0.8819444444444445 | 0 |
| 0.8826388888888889 | 0 |
| 0.8833333333333333 | 0 |
| 0.8840277777777777 | 0 |
| 0.8847222222222223 | 0 |
| 0.8854166666666666 | 0 |
| 0.8861111111111111 | 0 |
| 0.8868055555555556 | 0 |
| 0.8875000000000001 | 0 |
| 0.8881944444444444 | 0 |
| 0.8888888888888888 | 0 |
| 0.8895833333333334 | 0 |
| 0.8902777777777778 | 0 |
| 0.8909722222222222 | 0 |
| 0.8916666666666666 | 0 |
| 0.8923611111111112 | 0 |
| 0.8930555555555556 | 0 |
| 0.8937499999999999 | 0 |
| 0.8944444444444444 | 0 |
| 0.8951388888888889 | 0 |
| 0.8958333333333334 | 0 |
| 0.8965277777777777 | 0 |
| 0.8972222222222223 | 0 |
| 0.8979166666666667 | 0 |
| 0.8986111111111111 | 0 |
| 0.8993055555555555 | 0 |
| 0.9 | 0 |
| 0.9006944444444445 | 0 |
| 0.9013888888888889 | 0 |
| 0.9020833333333332 | 0 |
| 0.9027777777777778 | 0 |
| 0.9034722222222222 | 0 |
| 0.9041666666666667 | 0 |
| 0.904861111111111 | 0 |
| 0.9055555555555556 | 0 |
| 0.90625 | 0 |
| 0.9069444444444444 | 0 |
| 0.907638888888889 | 0 |
| 0.9083333333333333 | 0 |
| 0.9090277777777778 | 0 |
| 0.9097222222222222 | 0 |
| 0.9104166666666668 | 0 |
| 0.9111111111111111 | 0 |
| 0.9118055555555555 | 0 |
| 0.9125 | 0 |
| 0.9131944444444445 | 0 |
| 0.9138888888888889 | 0 |
| 0.9145833333333333 | 0 |
| 0.9152777777777777 | 0 |
| 0.9159722222222223 | 0 |
| 0.9166666666666666 | 0 |
| 0.9173611111111111 | 0 |
| 0.9180555555555556 | 0 |
| 0.9187500000000001 | 0 |
| 0.9194444444444444 | 0 |
| 0.9201388888888888 | 0 |
| 0.9208333333333334 | 0 |
| 0.9215277777777778 | 0 |
| 0.9222222222222222 | 0 |
| 0.9229166666666666 | 0 |
| 0.9236111111111112 | 0 |
| 0.9243055555555556 | 0 |
| 0.9249999999999999 | 0 |
| 0.9256944444444444 | 0 |
| 0.9263888888888889 | 0 |
| 0.9270833333333334 | 0 |
| 0.9277777777777777 | 0 |
| 0.9284722222222223 | 0 |
| 0.9291666666666667 | 0 |
| 0.9298611111111111 | 0 |
| 0.9305555555555555 | 0 |
| 0.93125 | 0 |
| 0.9319444444444445 | 0 |
| 0.9326388888888889 | 0 |
| 0.9333333333333332 | 0 |
| 0.9340277777777778 | 0 |
| 0.9347222222222222 | 0 |
| 0.9354166666666667 | 0 |
| 0.936111111111111 | 0 |
| 0.9368055555555556 | 0 |
| 0.9375 | 0 |
| 0.9381944444444444 | 0 |
| 0.938888888888889 | 0 |
| 0.9395833333333333 | 0 |
| 0.9402777777777778 | 0 |
| 0.9409722222222222 | 0 |
| 0.9416666666666668 | 0 |
| 0.9423611111111111 | 0 |
| 0.9430555555555555 | 0 |
| 0.94375 | 0 |
| 0.9444444444444445 | 0 |
| 0.9451388888888889 | 0 |
| 0.9458333333333333 | 0 |
| 0.9465277777777777 | 0 |
| 0.9472222222222223 | 0 |
| 0.9479166666666666 | 0 |
| 0.9486111111111111 | 0 |
| 0.9493055555555556 | 0 |
| 0.9500000000000001 | 0 |
| 0.9506944444444444 | 0 |
| 0.9513888888888888 | 0 |
| 0.9520833333333334 | 0 |
| 0.9527777777777778 | 0 |
| 0.9534722222222222 | 0 |
| 0.9541666666666666 | 0 |
| 0.9548611111111112 | 0 |
| 0.9555555555555556 | 0 |
| 0.9562499999999999 | 0 |
| 0.9569444444444444 | 0 |
| 0.9576388888888889 | 0 |
| 0.9583333333333334 | 0 |
| 0.9590277777777777 | 0 |
| 0.9597222222222223 | 0 |
| 0.9604166666666667 | 0 |
| 0.9611111111111111 | 0 |
| 0.9618055555555555 | 0 |
| 0.9625 | 0 |
| 0.9631944444444445 | 0 |
| 0.9638888888888889 | 0 |
| 0.9645833333333332 | 0 |
| 0.9652777777777778 | 0 |
| 0.9659722222222222 | 0 |
| 0.9666666666666667 | 0 |
| 0.967361111111111 | 0 |
| 0.9680555555555556 | 0 |
| 0.96875 | 0 |
| 0.9694444444444444 | 0 |
| 0.970138888888889 | 0 |
| 0.9708333333333333 | 0 |
| 0.9715277777777778 | 0 |
| 0.9722222222222222 | 0 |
| 0.9729166666666668 | 0 |
| 0.9736111111111111 | 0 |
| 0.9743055555555555 | 0 |
| 0.975 | 0 |
| 0.9756944444444445 | 0 |
| 0.9763888888888889 | 0 |
| 0.9770833333333333 | 0 |
| 0.9777777777777777 | 0 |
| 0.9784722222222223 | 0 |
| 0.9791666666666666 | 0 |
| 0.9798611111111111 | 0 |
| 0.9805555555555556 | 0 |
| 0.9812500000000001 | 0 |
| 0.9819444444444444 | 0 |
| 0.9826388888888888 | 0 |
| 0.9833333333333334 | 0 |
| 0.9840277777777778 | 0 |
| 0.9847222222222222 | 0 |
| 0.9854166666666666 | 0 |
| 0.9861111111111112 | 0 |
| 0.9868055555555556 | 0 |
| 0.9874999999999999 | 0 |
| 0.9881944444444444 | 0 |
| 0.9888888888888889 | 0 |
| 0.9895833333333334 | 0 |
| 0.9902777777777777 | 0 |
| 0.9909722222222223 | 0 |
| 0.9916666666666667 | 0 |
| 0.9923611111111111 | 0 |
| 0.9930555555555555 | 0 |
| 0.99375 | 0 |
| 0.9944444444444445 | 0 |
| 0.9951388888888889 | 0 |
| 0.9958333333333332 | 0 |
| 0.9965277777777778 | 0 |
| 0.9972222222222222 | 0 |
| 0.9979166666666667 | 0 |
| 0.998611111111111 | 0 |
| 0.9993055555555556 | 0 |